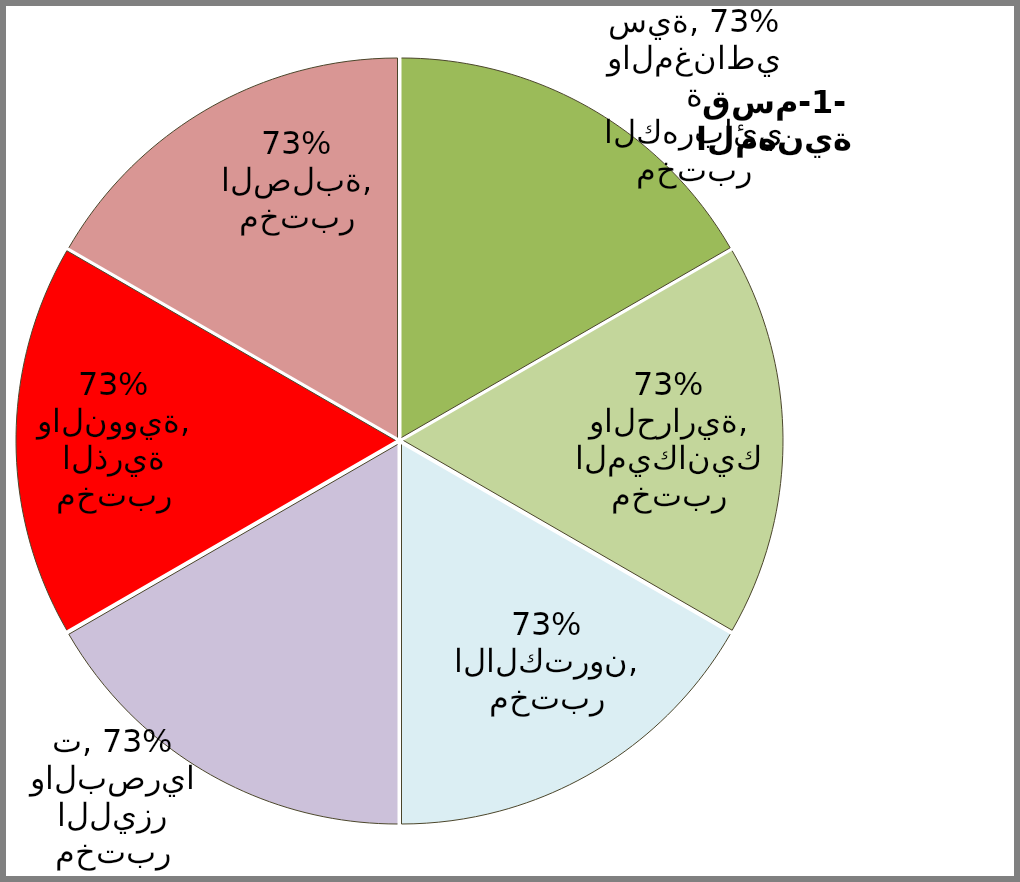
| Category | Series 2 | Series 3 | Series 1 | Series 0 |
|---|---|---|---|---|
| مختبر الكهربائية والمغناطيسية | 0.727 | 0.783 | 1 | 0.783 |
| مختبر الميكانيك والحرارية | 0.727 | 0.867 | 0.545 | 0.867 |
| مختبر الالكترون | 0.727 | 0.914 | 0.909 | 0.914 |
| مختبر الليزر والبصريات | 0.727 | 0.8 | 0.818 | 0.8 |
| مختبر الذرية والنووية | 0.727 | 0.872 | 0.727 | 0.872 |
| مختبر الصلبة | 0.727 | 0.6 | 0.455 | 0.6 |